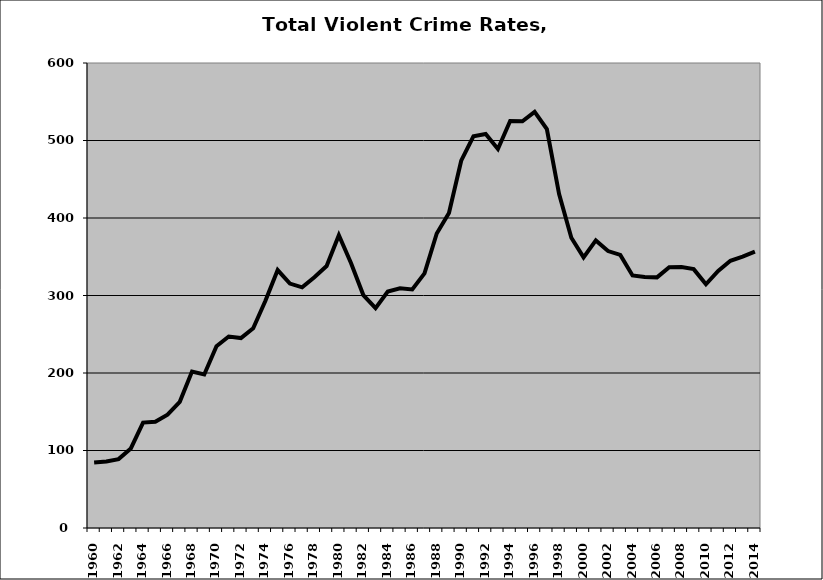
| Category | VCR |
|---|---|
| 1960.0 | 84.611 |
| 1961.0 | 85.842 |
| 1962.0 | 88.887 |
| 1963.0 | 102.663 |
| 1964.0 | 136.041 |
| 1965.0 | 137.052 |
| 1966.0 | 146.32 |
| 1967.0 | 162.86 |
| 1968.0 | 201.875 |
| 1969.0 | 198.144 |
| 1970.0 | 234.593 |
| 1971.0 | 247.08 |
| 1972.0 | 245.095 |
| 1973.0 | 257.637 |
| 1974.0 | 293.265 |
| 1975.0 | 332.838 |
| 1976.0 | 315.372 |
| 1977.0 | 310.563 |
| 1978.0 | 323.465 |
| 1979.0 | 338.037 |
| 1980.0 | 377.817 |
| 1981.0 | 341.603 |
| 1982.0 | 300.567 |
| 1983.0 | 283.756 |
| 1984.0 | 305.22 |
| 1985.0 | 309.402 |
| 1986.0 | 307.722 |
| 1987.0 | 328.494 |
| 1988.0 | 380.036 |
| 1989.0 | 406.49 |
| 1990.0 | 473.922 |
| 1991.0 | 505.33 |
| 1992.0 | 508.495 |
| 1993.0 | 489.078 |
| 1994.0 | 525.122 |
| 1995.0 | 524.746 |
| 1996.0 | 536.997 |
| 1997.0 | 514.649 |
| 1998.0 | 430.971 |
| 1999.0 | 374.581 |
| 2000.0 | 349.15 |
| 2001.0 | 371.062 |
| 2002.0 | 357.338 |
| 2003.0 | 352.315 |
| 2004.0 | 325.928 |
| 2005.0 | 324.002 |
| 2006.0 | 323.401 |
| 2007.0 | 336.517 |
| 2008.0 | 336.865 |
| 2009.0 | 334.028 |
| 2010.0 | 314.461 |
| 2011.0 | 331.765 |
| 2012.0 | 344.826 |
| 2013.0 | 350.175 |
| 2014.0 | 356.655 |